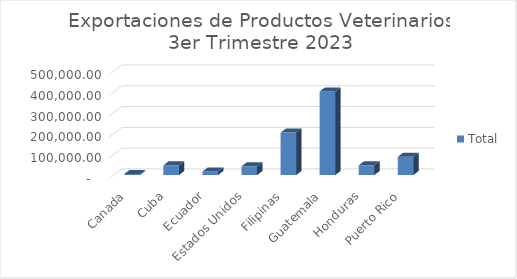
| Category | Total |
|---|---|
| Canada | 5075 |
| Cuba | 46745.4 |
| Ecuador | 16725 |
| Estados Unidos | 41816.52 |
| Filipinas | 204250 |
| Guatemala | 402022 |
| Honduras | 46620.4 |
| Puerto Rico | 87880 |